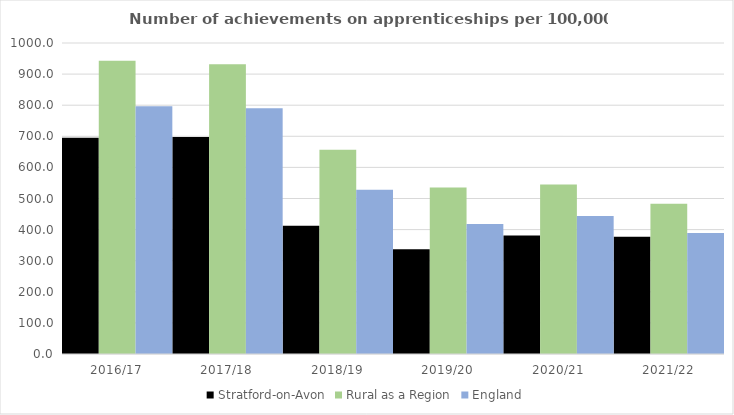
| Category | Stratford-on-Avon | Rural as a Region | England |
|---|---|---|---|
| 2016/17 | 695 | 942.594 | 797 |
| 2017/18 | 698 | 931.709 | 790 |
| 2018/19 | 412 | 656.44 | 528 |
| 2019/20 | 337 | 535.552 | 418 |
| 2020/21 | 381 | 545.333 | 444 |
| 2021/22 | 377 | 482.936 | 389 |